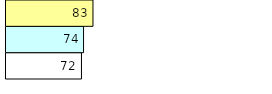
| Category | Total Standouts | Total Recd | Total Tipsters |
|---|---|---|---|
| 0 | 72 | 74 | 83 |